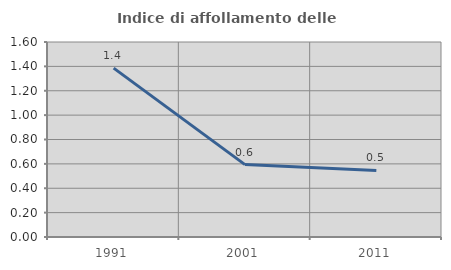
| Category | Indice di affollamento delle abitazioni  |
|---|---|
| 1991.0 | 1.386 |
| 2001.0 | 0.594 |
| 2011.0 | 0.546 |